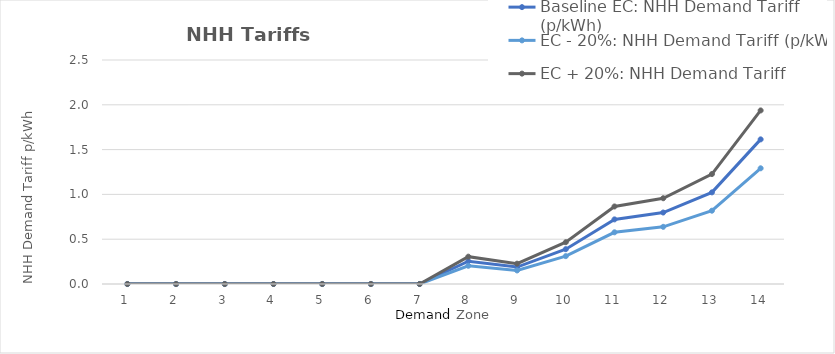
| Category | Baseline EC: NHH Demand Tariff (p/kWh) | EC - 20%: NHH Demand Tariff (p/kWh) | EC + 20%: NHH Demand Tariff (p/kWh) |
|---|---|---|---|
| 0 | 0 | 0 | 0 |
| 1 | 0 | 0 | 0 |
| 2 | 0 | 0 | 0 |
| 3 | 0 | 0 | 0 |
| 4 | 0 | 0 | 0 |
| 5 | 0 | 0 | 0 |
| 6 | 0 | 0 | 0 |
| 7 | 0.254 | 0.203 | 0.305 |
| 8 | 0.189 | 0.151 | 0.227 |
| 9 | 0.389 | 0.311 | 0.466 |
| 10 | 0.721 | 0.577 | 0.865 |
| 11 | 0.798 | 0.638 | 0.957 |
| 12 | 1.023 | 0.818 | 1.227 |
| 13 | 1.614 | 1.291 | 1.937 |